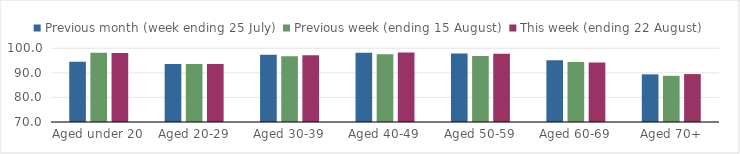
| Category | Previous month (week ending 25 July) | Previous week (ending 15 August) | This week (ending 22 August) |
|---|---|---|---|
| Aged under 20 | 94.49 | 98.215 | 98.032 |
| Aged 20-29 | 93.559 | 93.6 | 93.616 |
| Aged 30-39 | 97.388 | 96.757 | 97.126 |
| Aged 40-49 | 98.203 | 97.589 | 98.261 |
| Aged 50-59 | 97.922 | 96.893 | 97.767 |
| Aged 60-69 | 95.163 | 94.37 | 94.256 |
| Aged 70+ | 89.396 | 88.807 | 89.505 |